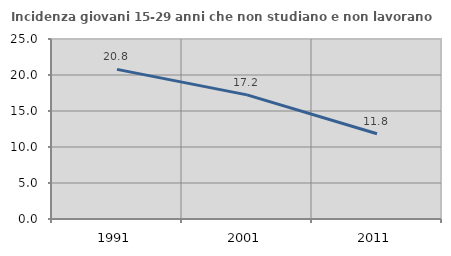
| Category | Incidenza giovani 15-29 anni che non studiano e non lavorano  |
|---|---|
| 1991.0 | 20.779 |
| 2001.0 | 17.241 |
| 2011.0 | 11.842 |